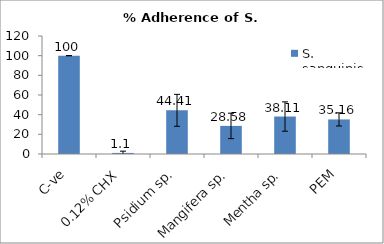
| Category | S. sanguinis |
|---|---|
| C-ve | 100 |
| 0.12% CHX | 1.1 |
| Psidium sp. | 44.41 |
| Mangifera sp. | 28.58 |
| Mentha sp. | 38.11 |
| PEM | 35.16 |